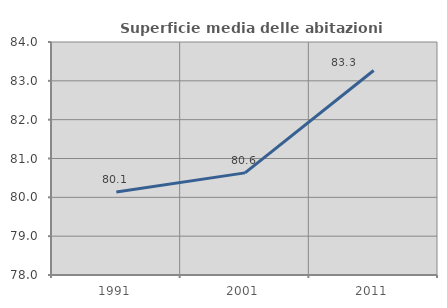
| Category | Superficie media delle abitazioni occupate |
|---|---|
| 1991.0 | 80.138 |
| 2001.0 | 80.63 |
| 2011.0 | 83.265 |